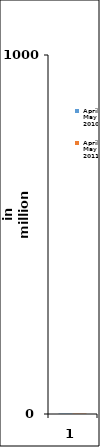
| Category | April- May 2010 | April-May 2011 |
|---|---|---|
| 0 | 1 | 1 |